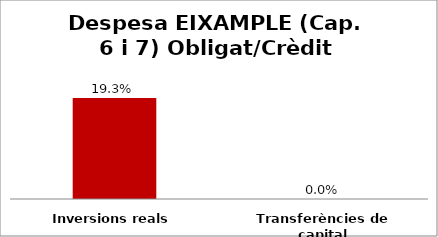
| Category | Series 0 |
|---|---|
| Inversions reals | 0.193 |
| Transferències de capital | 0 |